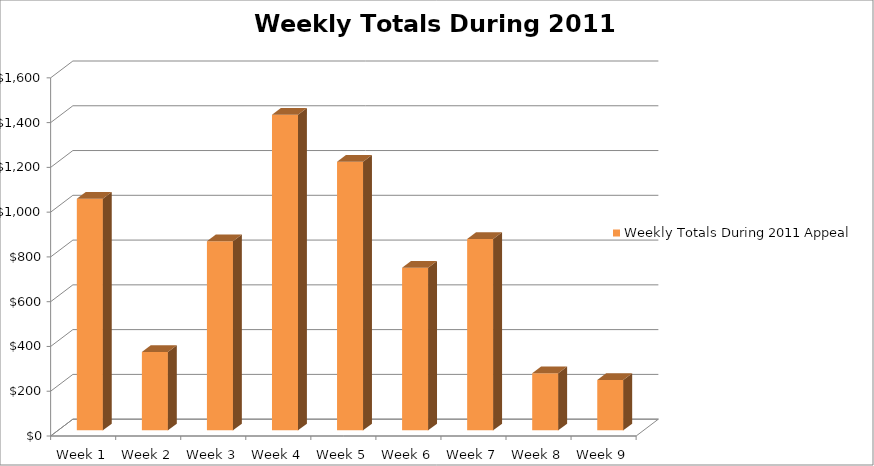
| Category | Weekly Totals During 2011 Appeal |
|---|---|
| Week 1 | 1035 |
| Week 2 | 350 |
| Week 3 | 845 |
| Week 4 | 1410 |
| Week 5 | 1200 |
| Week 6 | 727 |
| Week 7 | 855 |
| Week 8 | 255 |
| Week 9 | 225 |